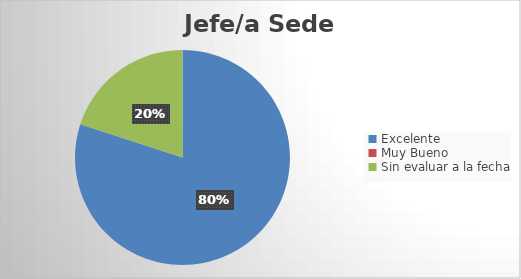
| Category | Cantidad |
|---|---|
| Excelente | 4 |
| Muy Bueno | 0 |
| Sin evaluar a la fecha | 1 |